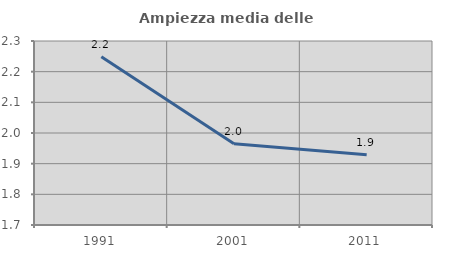
| Category | Ampiezza media delle famiglie |
|---|---|
| 1991.0 | 2.249 |
| 2001.0 | 1.965 |
| 2011.0 | 1.929 |